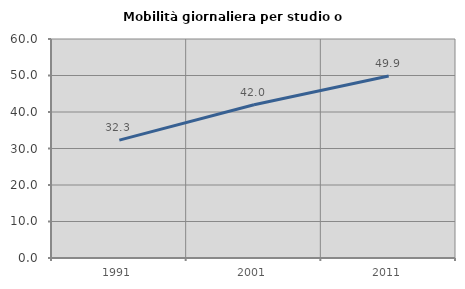
| Category | Mobilità giornaliera per studio o lavoro |
|---|---|
| 1991.0 | 32.302 |
| 2001.0 | 41.993 |
| 2011.0 | 49.859 |